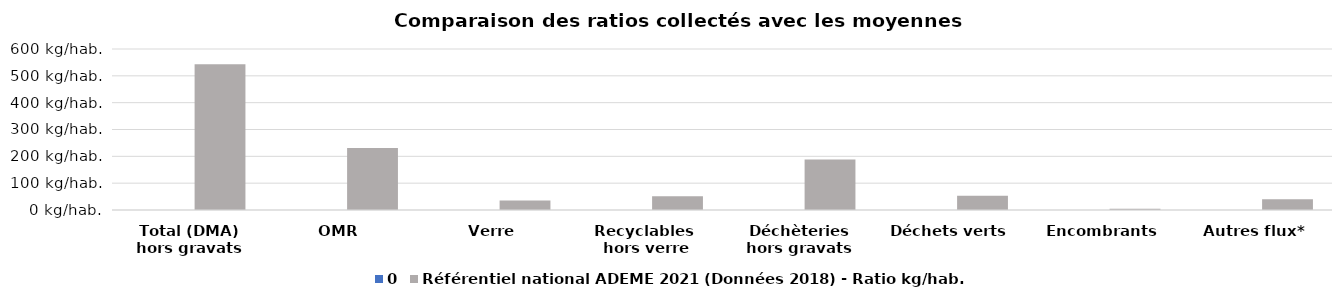
| Category | 0 | Référentiel national ADEME 2021 (Données 2018) - Ratio kg/hab. |
|---|---|---|
| Total (DMA)
hors gravats |  | 543 |
| OMR |  | 231 |
| Verre |  | 35 |
| Recyclables 
hors verre |  | 51 |
| Déchèteries
hors gravats |  | 188 |
| Déchets verts |  | 53 |
| Encombrants |  | 5 |
| Autres flux* |  | 40 |